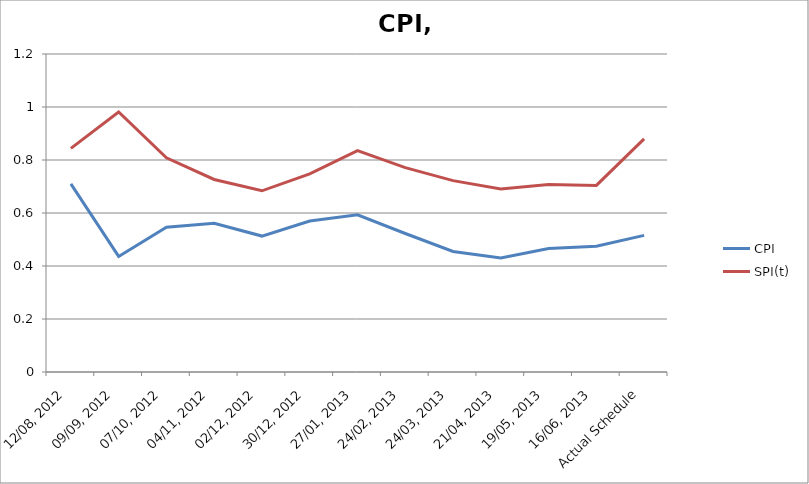
| Category | CPI | SPI(t) |
|---|---|---|
| 12/08, 2012 | 0.71 | 0.844 |
| 09/09, 2012 | 0.436 | 0.981 |
| 07/10, 2012 | 0.546 | 0.808 |
| 04/11, 2012 | 0.561 | 0.727 |
| 02/12, 2012 | 0.513 | 0.684 |
| 30/12, 2012 | 0.569 | 0.748 |
| 27/01, 2013 | 0.593 | 0.836 |
| 24/02, 2013 | 0.523 | 0.771 |
| 24/03, 2013 | 0.455 | 0.722 |
| 21/04, 2013 | 0.43 | 0.691 |
| 19/05, 2013 | 0.466 | 0.707 |
| 16/06, 2013 | 0.475 | 0.704 |
| Actual Schedule | 0.516 | 0.88 |